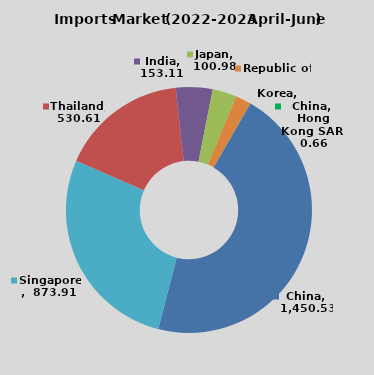
| Category | Series 0 |
|---|---|
| China | 1450.53 |
| Singapore | 873.91 |
| Thailand | 530.61 |
| India | 153.11 |
| Japan | 100.98 |
| Republic of  Korea | 64.69 |
| China, Hong Kong SAR | 0.66 |